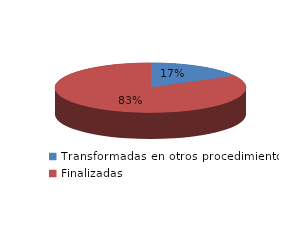
| Category | Series 0 |
|---|---|
| Transformadas en otros procedimientos | 2361 |
| Finalizadas | 11561 |